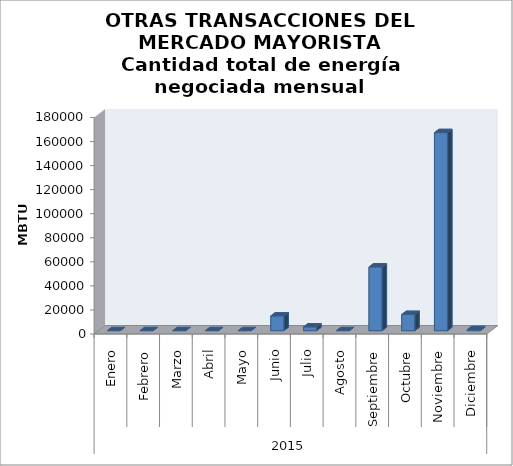
| Category | Cantidad Total
(MBTU) |
|---|---|
| 0 | 0 |
| 1 | 0 |
| 2 | 0 |
| 3 | 0 |
| 4 | 0 |
| 5 | 12300 |
| 6 | 3139 |
| 7 | 0 |
| 8 | 53000 |
| 9 | 13456 |
| 10 | 164636 |
| 11 | 849 |